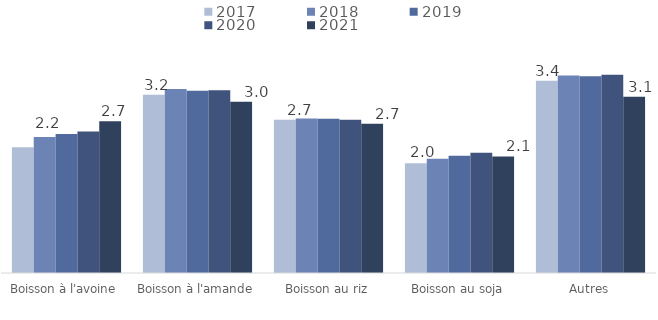
| Category | 2017 | 2018 | 2019 | 2020 | 2021 |
|---|---|---|---|---|---|
| Boisson à l'avoine | 2.234 | 2.419 | 2.471 | 2.515 | 2.696 |
| Boisson à l'amande | 3.168 | 3.27 | 3.241 | 3.249 | 3.045 |
| Boisson au riz | 2.724 | 2.747 | 2.741 | 2.723 | 2.653 |
| Boisson au soja | 1.952 | 2.03 | 2.085 | 2.138 | 2.071 |
| Autres | 3.42 | 3.509 | 3.498 | 3.526 | 3.133 |